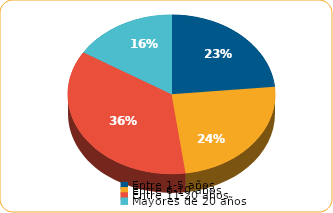
| Category | Series 0 |
|---|---|
| Entre 1-5 años | 3307.5 |
| Entre 6-10 años | 3427.4 |
| Entre 11-20 años | 5067 |
| Mayores de 20 años | 2275.3 |